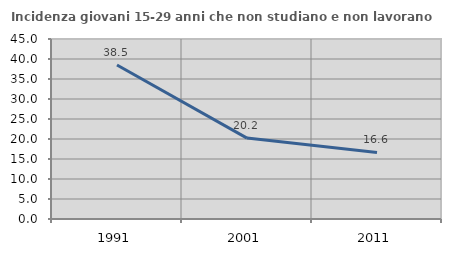
| Category | Incidenza giovani 15-29 anni che non studiano e non lavorano  |
|---|---|
| 1991.0 | 38.494 |
| 2001.0 | 20.232 |
| 2011.0 | 16.64 |